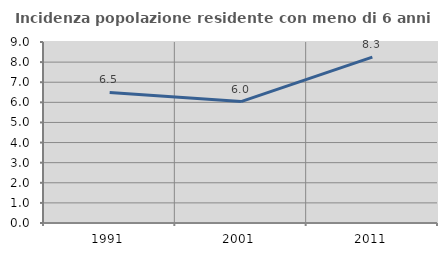
| Category | Incidenza popolazione residente con meno di 6 anni |
|---|---|
| 1991.0 | 6.489 |
| 2001.0 | 6.036 |
| 2011.0 | 8.251 |